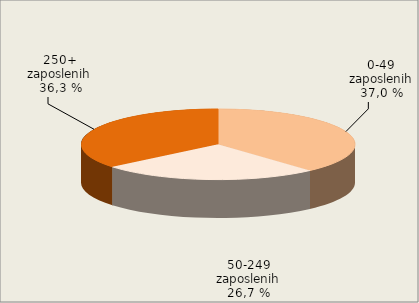
| Category | Broj zaposlenih osoba
Number of persons employed
  |
|---|---|
| 0-49 zaposlenih | 38.3 |
| 50-249 zaposlenih | 25.7 |
| 250+ zaposlenih | 36 |